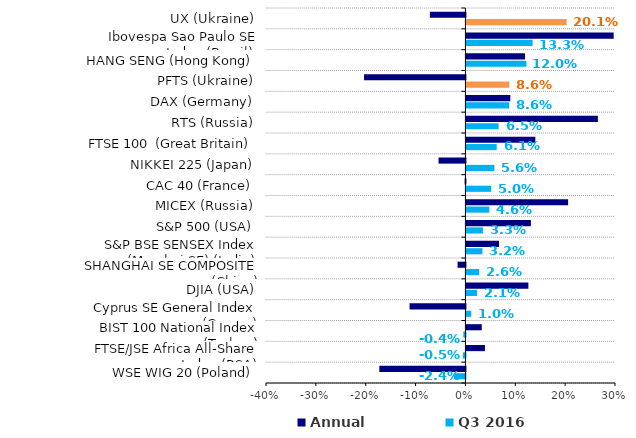
| Category | Q3 2016 | Annual |
|---|---|---|
| WSE WIG 20 (Poland) | -0.024 | -0.173 |
| FTSE/JSE Africa All-Share Index (RSA) | -0.005 | 0.037 |
| BIST 100 National Index (Тurkey) | -0.004 | 0.031 |
| Cyprus SE General Index (Cyprus) | 0.01 | -0.112 |
| DJIA (USA) | 0.021 | 0.124 |
| SHANGHAI SE COMPOSITE (China) | 0.026 | -0.016 |
| S&P BSE SENSEX Index (Mumbai SE) (Іndia) | 0.032 | 0.065 |
| S&P 500 (USA) | 0.033 | 0.129 |
| МICEX (Russia) | 0.046 | 0.204 |
| CAC 40 (France) | 0.05 | -0.002 |
| NIKKEI 225 (Japan) | 0.056 | -0.054 |
| FTSE 100  (Great Britain) | 0.061 | 0.138 |
| RTS (Russia) | 0.065 | 0.264 |
| DAX (Germany) | 0.086 | 0.088 |
| PFTS (Ukraine) | 0.086 | -0.203 |
| HANG SENG (Hong Kong) | 0.12 | 0.118 |
| Ibovespa Sao Paulo SE Index (Brazil)  | 0.133 | 0.295 |
| UX (Ukraine) | 0.201 | -0.071 |